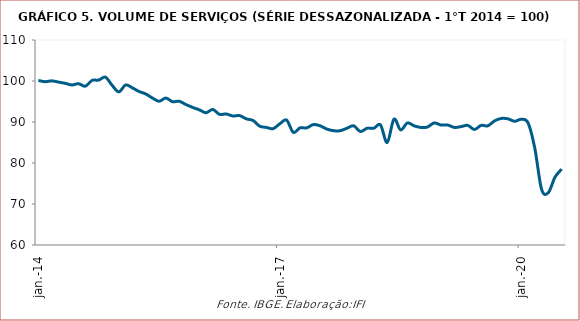
| Category | Volume de serviços |
|---|---|
| 2014-01-01 | 100.133 |
| 2014-02-01 | 99.834 |
| 2014-03-01 | 100.033 |
| 2014-04-01 | 99.734 |
| 2014-05-01 | 99.435 |
| 2014-06-01 | 99.037 |
| 2014-07-01 | 99.336 |
| 2014-08-01 | 98.738 |
| 2014-09-01 | 100.133 |
| 2014-10-01 | 100.232 |
| 2014-11-01 | 100.93 |
| 2014-12-01 | 98.937 |
| 2015-01-01 | 97.343 |
| 2015-02-01 | 99.037 |
| 2015-03-01 | 98.339 |
| 2015-04-01 | 97.443 |
| 2015-05-01 | 96.845 |
| 2015-06-01 | 95.849 |
| 2015-07-01 | 95.051 |
| 2015-08-01 | 95.849 |
| 2015-09-01 | 94.952 |
| 2015-10-01 | 95.051 |
| 2015-11-01 | 94.254 |
| 2015-12-01 | 93.557 |
| 2016-01-01 | 92.959 |
| 2016-02-01 | 92.262 |
| 2016-03-01 | 93.059 |
| 2016-04-01 | 91.863 |
| 2016-05-01 | 91.963 |
| 2016-06-01 | 91.465 |
| 2016-07-01 | 91.564 |
| 2016-08-01 | 90.767 |
| 2016-09-01 | 90.369 |
| 2016-10-01 | 88.974 |
| 2016-11-01 | 88.675 |
| 2016-12-01 | 88.376 |
| 2017-01-01 | 89.572 |
| 2017-02-01 | 90.468 |
| 2017-03-01 | 87.479 |
| 2017-04-01 | 88.575 |
| 2017-05-01 | 88.575 |
| 2017-06-01 | 89.372 |
| 2017-07-01 | 89.073 |
| 2017-08-01 | 88.276 |
| 2017-09-01 | 87.878 |
| 2017-10-01 | 87.878 |
| 2017-11-01 | 88.476 |
| 2017-12-01 | 89.073 |
| 2018-01-01 | 87.679 |
| 2018-02-01 | 88.476 |
| 2018-03-01 | 88.476 |
| 2018-04-01 | 89.273 |
| 2018-05-01 | 84.988 |
| 2018-06-01 | 90.668 |
| 2018-07-01 | 88.077 |
| 2018-08-01 | 89.771 |
| 2018-09-01 | 89.073 |
| 2018-10-01 | 88.675 |
| 2018-11-01 | 88.774 |
| 2018-12-01 | 89.771 |
| 2019-01-01 | 89.273 |
| 2019-02-01 | 89.273 |
| 2019-03-01 | 88.675 |
| 2019-04-01 | 88.874 |
| 2019-05-01 | 89.173 |
| 2019-06-01 | 88.177 |
| 2019-07-01 | 89.173 |
| 2019-08-01 | 89.073 |
| 2019-09-01 | 90.269 |
| 2019-10-01 | 90.867 |
| 2019-11-01 | 90.767 |
| 2019-12-01 | 90.169 |
| 2020-01-01 | 90.668 |
| 2020-02-01 | 89.771 |
| 2020-03-01 | 83.593 |
| 2020-04-01 | 73.63 |
| 2020-05-01 | 72.733 |
| 2020-06-01 | 76.519 |
| 2020-07-01 | 78.512 |